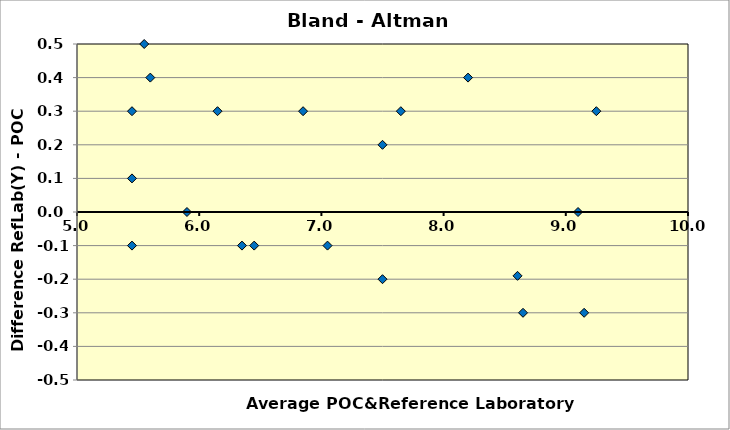
| Category | Bland - Altman Plot |
|---|---|
| 6.45 | -0.1 |
| 5.449999999999999 | 0.3 |
| 8.65 | -0.3 |
| 9.25 | 0.3 |
| 5.45 | -0.1 |
| 5.6 | 0.4 |
| 6.85 | 0.3 |
| 7.5 | 0.2 |
| 8.2 | 0.4 |
| 5.45 | 0.1 |
| 7.5 | -0.2 |
| 7.05 | -0.1 |
| 9.1 | 0 |
| 7.65 | 0.3 |
| 6.15 | 0.3 |
| 5.55 | 0.5 |
| 8.605 | -0.19 |
| 6.35 | -0.1 |
| 5.9 | 0 |
| 9.15 | -0.3 |